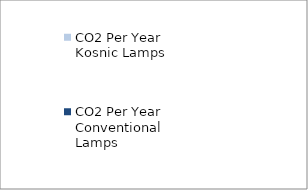
| Category | CO2 Per Year Kosnic Lamps | CO2 Per Year Conventional Lamps |
|---|---|---|
| 0 | 57.687 | 149.986 |